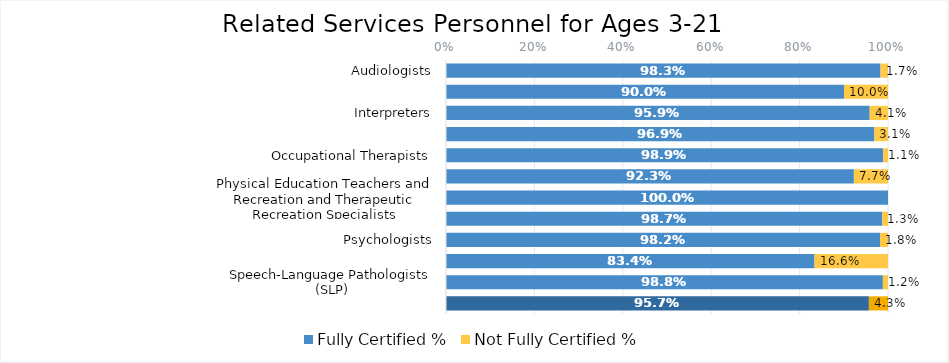
| Category | Fully Certified % | Not Fully Certified % |
|---|---|---|
| Audiologists | 0.983 | 0.017 |
| Counselors and Rehabilitation Counselors | 0.9 | 0.1 |
| Interpreters | 0.959 | 0.041 |
| Medical / Nursing Service Staff | 0.969 | 0.031 |
| Occupational Therapists | 0.989 | 0.011 |
| Orientation and Mobility Specialists | 0.923 | 0.077 |
| Physical Education Teachers and Recreation and Therapeutic Recreation Specialists | 1 | 0 |
| Physical Therapists | 0.987 | 0.013 |
| Psychologists | 0.982 | 0.018 |
| Social Workers | 0.834 | 0.166 |
| Speech-Language Pathologists (SLP) | 0.988 | 0.012 |
| Total Certified Status | 0.957 | 0.043 |